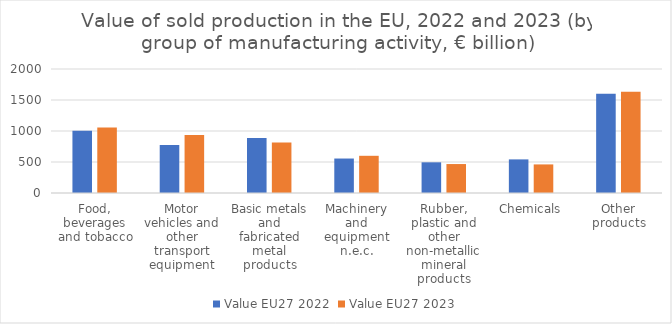
| Category | Value EU27 2022 | Value EU27 2023 |
|---|---|---|
| Food, beverages and tobacco | 1006 | 1056 |
| Motor vehicles and other transport equipment | 776 | 934 |
| Basic metals and fabricated metal products | 888 | 816 |
| Machinery and equipment n.e.c. | 556 | 600 |
| Rubber, plastic and other non-metallic mineral products | 495 | 467 |
| Chemicals | 542 | 461 |
| Other products | 1602 | 1633 |